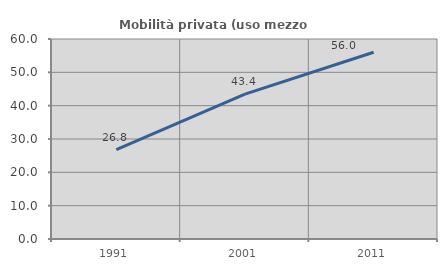
| Category | Mobilità privata (uso mezzo privato) |
|---|---|
| 1991.0 | 26.844 |
| 2001.0 | 43.441 |
| 2011.0 | 56.014 |